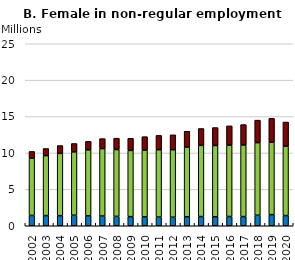
| Category | Under 25 | 25-60  | Over 60 |
|---|---|---|---|
| 2002.0 | 1.42 | 7.86 | 0.93 |
| 2003.0 | 1.4 | 8.23 | 0.98 |
| 2004.0 | 1.39 | 8.55 | 1.08 |
| 2005.0 | 1.45 | 8.7 | 1.15 |
| 2006.0 | 1.36 | 9.07 | 1.16 |
| 2007.0 | 1.34 | 9.26 | 1.37 |
| 2008.0 | 1.29 | 9.18 | 1.56 |
| 2009.0 | 1.25 | 9.1 | 1.66 |
| 2010.0 | 1.22 | 9.17 | 1.85 |
| 2011.0 | 1.19 | 9.26 | 1.96 |
| 2012.0 | 1.17 | 9.28 | 2.04 |
| 2013.0 | 1.24 | 9.57 | 2.17 |
| 2014.0 | 1.26 | 9.79 | 2.31 |
| 2015.0 | 1.23 | 9.79 | 2.47 |
| 2016.0 | 1.27 | 9.8 | 2.65 |
| 2017.0 | 1.26 | 9.84 | 2.8 |
| 2018.0 | 1.45 | 9.97 | 3.09 |
| 2019.0 | 1.53 | 9.95 | 3.28 |
| 2020.0 | 1.4 | 9.53 | 3.32 |